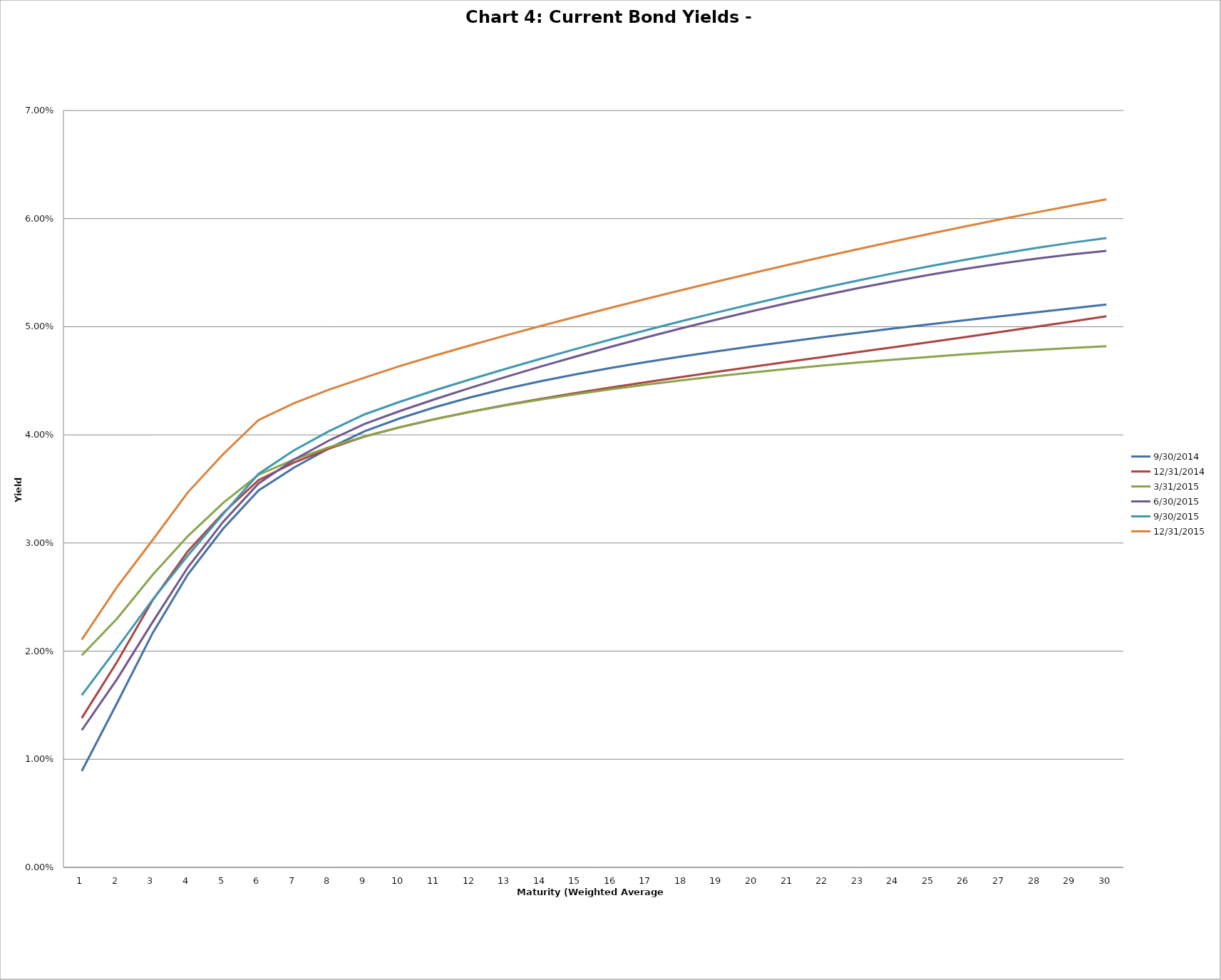
| Category | 9/30/2014 | 12/31/2014 | 3/31/2015 | 6/30/2015 | 9/30/2015 | 12/31/2015 |
|---|---|---|---|---|---|---|
| 0 | 0.009 | 0.014 | 0.02 | 0.013 | 0.016 | 0.021 |
| 1 | 0.015 | 0.019 | 0.023 | 0.017 | 0.02 | 0.026 |
| 2 | 0.022 | 0.025 | 0.027 | 0.023 | 0.025 | 0.03 |
| 3 | 0.027 | 0.029 | 0.031 | 0.028 | 0.029 | 0.035 |
| 4 | 0.031 | 0.033 | 0.034 | 0.032 | 0.033 | 0.038 |
| 5 | 0.035 | 0.036 | 0.036 | 0.035 | 0.036 | 0.041 |
| 6 | 0.037 | 0.037 | 0.038 | 0.038 | 0.039 | 0.043 |
| 7 | 0.039 | 0.039 | 0.039 | 0.039 | 0.04 | 0.044 |
| 8 | 0.04 | 0.04 | 0.04 | 0.041 | 0.042 | 0.045 |
| 9 | 0.042 | 0.041 | 0.041 | 0.042 | 0.043 | 0.046 |
| 10 | 0.043 | 0.041 | 0.041 | 0.043 | 0.044 | 0.047 |
| 11 | 0.043 | 0.042 | 0.042 | 0.044 | 0.045 | 0.048 |
| 12 | 0.044 | 0.043 | 0.043 | 0.045 | 0.046 | 0.049 |
| 13 | 0.045 | 0.043 | 0.043 | 0.046 | 0.047 | 0.05 |
| 14 | 0.046 | 0.044 | 0.044 | 0.047 | 0.048 | 0.051 |
| 15 | 0.046 | 0.044 | 0.044 | 0.048 | 0.049 | 0.052 |
| 16 | 0.047 | 0.045 | 0.045 | 0.049 | 0.05 | 0.053 |
| 17 | 0.047 | 0.045 | 0.045 | 0.05 | 0.051 | 0.053 |
| 18 | 0.048 | 0.046 | 0.045 | 0.051 | 0.051 | 0.054 |
| 19 | 0.048 | 0.046 | 0.046 | 0.051 | 0.052 | 0.055 |
| 20 | 0.049 | 0.047 | 0.046 | 0.052 | 0.053 | 0.056 |
| 21 | 0.049 | 0.047 | 0.046 | 0.053 | 0.054 | 0.056 |
| 22 | 0.049 | 0.048 | 0.047 | 0.054 | 0.054 | 0.057 |
| 23 | 0.05 | 0.048 | 0.047 | 0.054 | 0.055 | 0.058 |
| 24 | 0.05 | 0.049 | 0.047 | 0.055 | 0.056 | 0.059 |
| 25 | 0.051 | 0.049 | 0.047 | 0.055 | 0.056 | 0.059 |
| 26 | 0.051 | 0.05 | 0.048 | 0.056 | 0.057 | 0.06 |
| 27 | 0.051 | 0.05 | 0.048 | 0.056 | 0.057 | 0.061 |
| 28 | 0.052 | 0.05 | 0.048 | 0.057 | 0.058 | 0.061 |
| 29 | 0.052 | 0.051 | 0.048 | 0.057 | 0.058 | 0.062 |